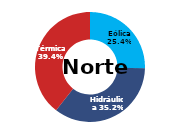
| Category | Norte |
|---|---|
| Eólica | 96.714 |
| Hidráulica | 133.965 |
| Solar | 0 |
| Térmica | 150.256 |